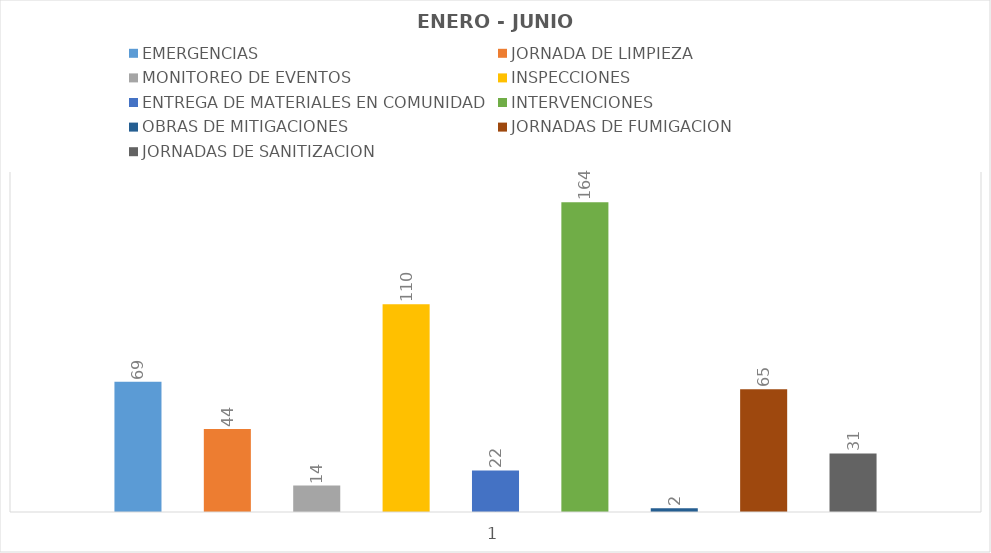
| Category | EMERGENCIAS  | JORNADA DE LIMPIEZA | MONITOREO DE EVENTOS  | INSPECCIONES | ENTREGA DE MATERIALES EN COMUNIDAD | INTERVENCIONES | OBRAS DE MITIGACIONES | JORNADAS DE FUMIGACION | JORNADAS DE SANITIZACION |
|---|---|---|---|---|---|---|---|---|---|
| 0 | 69 | 44 | 14 | 110 | 22 | 164 | 2 | 65 | 31 |